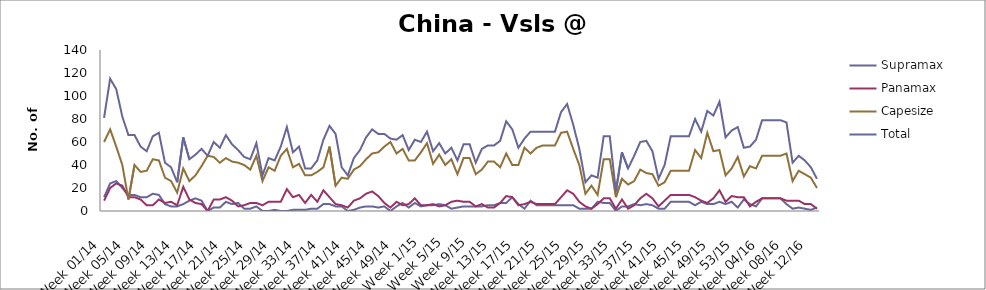
| Category | Supramax | Panamax | Capesize | Total |
|---|---|---|---|---|
| Week 01/14 | 12 | 9 | 60 | 81 |
| Week 02/14 | 24 | 20 | 71 | 115 |
| Week 03/14 | 26 | 24 | 56 | 106 |
| Week 04/14 | 20 | 22 | 40 | 82 |
| Week 05/14 | 14 | 12 | 10 | 66 |
| Week 06/14 | 14 | 12 | 40 | 66 |
| Week 07/14 | 12 | 10 | 34 | 56 |
| Week 08/14 | 12 | 5 | 35 | 52 |
| Week 09/14 | 15 | 5 | 45 | 65 |
| Week 10/14 | 14 | 10 | 44 | 68 |
| Week 11/14 | 6 | 7 | 29 | 42 |
| Week 12/14 | 4 | 8 | 26 | 38 |
| Week 13/14 | 4 | 5 | 16 | 25 |
| Week 14/14 | 6 | 21 | 37 | 64 |
| Week 15/14 | 9 | 10 | 26 | 45 |
| Week 16/14 | 11 | 7 | 31 | 49 |
| Week 17/14 | 9 | 6 | 39 | 54 |
| Week 18/14 | 0 | 0 | 48 | 48 |
| Week 19/14 | 3 | 10 | 47 | 60 |
| Week 20/14 | 3 | 10 | 42 | 55 |
| Week 21/14 | 8 | 12 | 46 | 66 |
| Week 22/14 | 6 | 9 | 43 | 58 |
| Week 23/14 | 7 | 4 | 42 | 53 |
| Week 24/14 | 2 | 5 | 40 | 47 |
| Week 25/14 | 2 | 7 | 36 | 45 |
| Week 26/14 | 4 | 7 | 48 | 59 |
| Week 27/14 | 0 | 5 | 26 | 31 |
| Week 28/14 | 0 | 8 | 38 | 46 |
| Week 29/14 | 1 | 8 | 35 | 44 |
| Week 30/14 | 0 | 8 | 48 | 56 |
| Week 31/14 | 0 | 19 | 54 | 73 |
| Week 32/14 | 1 | 12 | 38 | 51 |
| Week 33/14 | 1 | 14 | 41 | 56 |
| Week 34/14 | 1 | 7 | 31 | 37 |
| Week 35/14 | 2 | 14 | 31 | 37 |
| Week 36/14 | 2 | 8 | 34 | 44 |
| Week 37/14 | 6 | 18 | 38 | 62 |
| Week 38/14 | 6 | 12 | 56 | 74 |
| Week 39/14 | 4 | 6 | 22 | 67 |
| Week 40/14 | 4 | 5 | 29 | 38 |
| Week 41/14 | 0 | 3 | 28 | 31 |
| Week 42/14 | 1 | 9 | 36 | 46 |
| Week 43/14 | 3 | 11 | 39 | 53 |
| Week 44/14 | 4 | 15 | 45 | 64 |
| Week 45/14 | 4 | 17 | 50 | 71 |
| Week 46/14 | 3 | 13 | 51 | 67 |
| Week 47/14 | 4 | 7 | 56 | 67 |
| Week 48/14 | 0 | 3 | 60 | 63 |
| Week 49/14 | 4 | 8 | 50 | 62 |
| Week 50/14 | 7 | 5 | 54 | 66 |
| Week 51/14 | 3 | 6 | 44 | 53 |
| Week 52/14 | 7 | 11 | 44 | 62 |
| Week 1/15 | 4 | 5 | 51 | 60 |
| Week 2/15 | 5 | 5 | 59 | 69 |
| Week 3/15 | 5 | 6 | 41 | 52 |
| Week 4/15 | 6 | 4 | 49 | 59 |
| Week 5/15 | 5 | 5 | 40 | 50 |
| Week 6/15 | 2 | 8 | 45 | 55 |
| Week 7/15 | 3 | 9 | 32 | 44 |
| Week 8/15 | 4 | 8 | 46 | 58 |
| Week 9/15 | 4 | 8 | 46 | 58 |
| Week 10/15 | 4 | 4 | 32 | 42 |
| Week 11/15 | 4 | 6 | 36 | 54 |
| Week 12/15 | 5 | 3 | 43 | 57 |
| Week 13/15 | 5 | 3 | 43 | 57 |
| Week 14/15 | 7 | 7 | 38 | 61 |
| Week 15/15 | 7 | 13 | 50 | 78 |
| Week 16/15 | 12 | 12 | 40 | 71 |
| Week 17/15 | 6 | 5 | 40 | 55 |
| Week 18/15 | 2 | 6 | 55 | 63 |
| Week 19/15 | 9 | 8 | 50 | 69 |
| Week 20/15 | 5 | 6 | 55 | 69 |
| Week 21/15 | 5 | 6 | 57 | 69 |
| Week 22/15 | 5 | 6 | 57 | 69 |
| Week 23/15 | 5 | 6 | 57 | 69 |
| Week 24/15 | 5 | 12 | 68 | 86 |
| Week 25/15 | 5 | 18 | 69 | 93 |
| Week 26/15 | 5 | 15 | 54 | 75 |
| Week 27/15 | 2 | 8 | 40 | 54 |
| Week 28/15 | 2 | 4 | 15 | 25 |
| Week 29/15 | 2 | 2 | 22 | 31 |
| Week 30/15 | 8 | 6 | 14 | 29 |
| Week 31/15 | 7 | 11 | 45 | 65 |
| Week 32/15 | 7 | 11 | 45 | 65 |
| Week 33/15 | 0 | 2 | 12 | 17 |
| Week 34/15 | 4 | 10 | 28 | 51 |
| Week 35/15 | 4 | 2 | 23 | 37 |
| Week 36/15 | 6 | 5 | 26 | 48 |
| Week 37/15 | 5 | 11 | 36 | 60 |
| Week 38/15 | 6 | 15 | 33 | 61 |
| Week 39/15 | 5 | 11 | 32 | 52 |
| Week 40/15 | 2 | 4 | 22 | 28 |
| Week 41/15 | 2 | 9 | 25 | 40 |
| Week 42/15 | 8 | 14 | 35 | 65 |
| Week 43/15 | 8 | 14 | 35 | 65 |
| Week 44/15 | 8 | 14 | 35 | 65 |
| Week 45/15 | 8 | 14 | 35 | 65 |
| Week 46/15 | 5 | 12 | 53 | 80 |
| Week 47/15 | 8 | 9 | 46 | 69 |
| Week 48/15 | 6 | 7 | 68 | 87 |
| Week 49/15 | 6 | 11 | 52 | 83 |
| Week 50/15 | 8 | 18 | 53 | 95 |
| Week 51/15 | 6 | 8 | 31 | 64 |
| Week 52/15 | 8 | 13 | 37 | 70 |
| Week 53/15 | 3 | 12 | 47 | 73 |
| Week 01/16 | 10 | 12 | 30 | 55 |
| Week 02/16 | 6 | 4 | 39 | 56 |
| Week 03/16 | 4 | 8 | 37 | 62 |
| Week 04/16 | 11 | 11 | 48 | 79 |
| Week 05/16 | 11 | 11 | 48 | 79 |
| Week 06/16 | 11 | 11 | 48 | 79 |
| Week 07/16 | 11 | 11 | 48 | 79 |
| Week 08/16 | 6 | 9 | 50 | 77 |
| Week 09/16 | 2 | 9 | 26 | 42 |
| Week 10/16 | 3 | 9 | 35 | 48 |
| Week 11/16 | 2 | 6 | 32 | 44 |
| Week 12/16 | 1 | 6 | 29 | 38 |
| Week 13/16 | 3 | 2 | 20 | 28 |